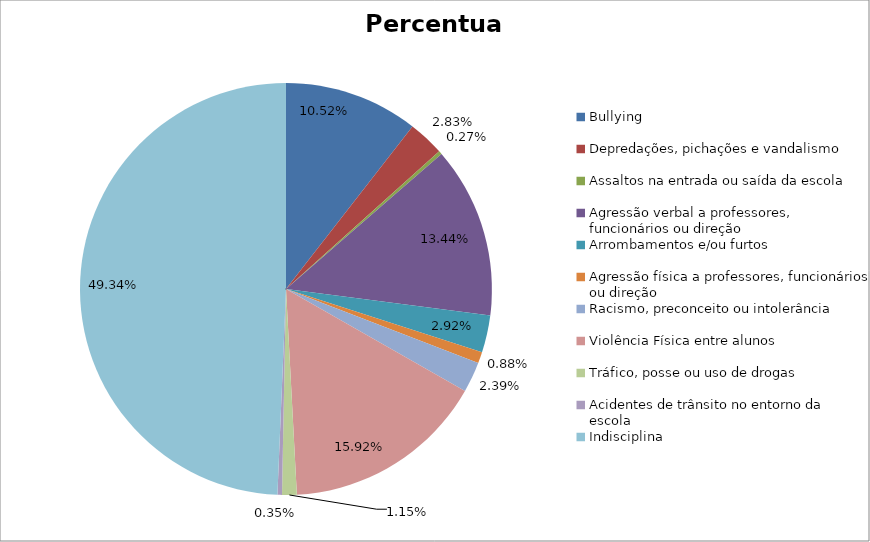
| Category | Percentual |
|---|---|
| Bullying | 0.105 |
| Depredações, pichações e vandalismo | 0.028 |
| Assaltos na entrada ou saída da escola | 0.003 |
| Agressão verbal a professores, funcionários ou direção | 0.134 |
| Arrombamentos e/ou furtos | 0.029 |
| Agressão física a professores, funcionários ou direção | 0.009 |
| Racismo, preconceito ou intolerância | 0.024 |
| Violência Física entre alunos | 0.159 |
| Tráfico, posse ou uso de drogas | 0.011 |
| Acidentes de trânsito no entorno da escola | 0.004 |
| Indisciplina | 0.493 |